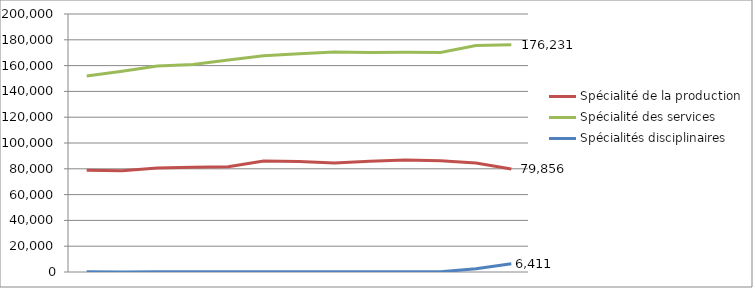
| Category | Spécialité de la production | Spécialité des services | Spécialités disciplinaires |
|---|---|---|---|
| 2007.0 | 78896 | 151867 | 114 |
| 2008.0 | 78523 | 155563 | 94 |
| 2009.0 | 80618 | 159603 | 101 |
| 2010.0 | 81206 | 160923 | 118 |
| 2011.0 | 81516 | 164373 | 136 |
| 2012.0 | 85993 | 167608 | 129 |
| 2013.0 | 85654 | 169180 | 133 |
| 2014.0 | 84584 | 170495 | 137 |
| 2015.0 | 85839 | 170090 | 137 |
| 2016.0 | 86768 | 170339 | 140 |
| 2017.0 | 86259 | 170157 | 147 |
| 2018.0 | 84493 | 175622 | 2511 |
| 2019.0 | 79856 | 176231 | 6411 |